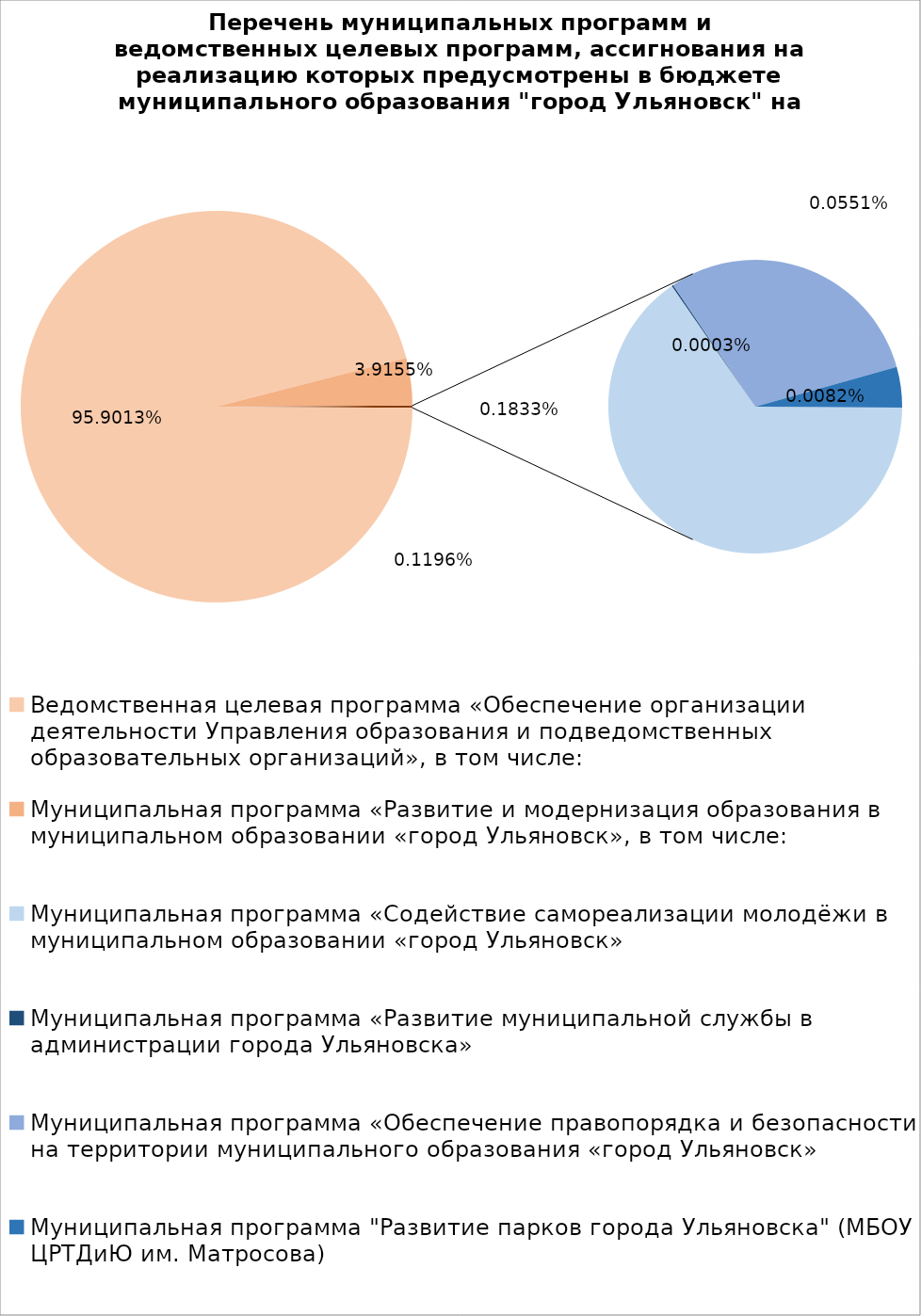
| Category | Series 0 |
|---|---|
| Ведомственная целевая программа «Обеспечение организации деятельности Управления образования и подведомственных образовательных организаций», в том числе: | 4696902.34 |
| Муниципальная программа «Развитие и модернизация образования в муниципальном образовании «город Ульяновск», в том числе: | 191765.8 |
| Муниципальная программа «Содействие самореализации молодёжи в муниципальном образовании «город Ульяновск» | 5860 |
| Муниципальная программа «Развитие муниципальной службы в администрации города Ульяновска» | 15.4 |
| Муниципальная программа «Обеспечение правопорядка и безопасности на территории муниципального образования «город Ульяновск» | 2700 |
| Муниципальная программа "Развитие парков города Ульяновска" (МБОУ ЦРТДиЮ им. Матросова) | 400 |